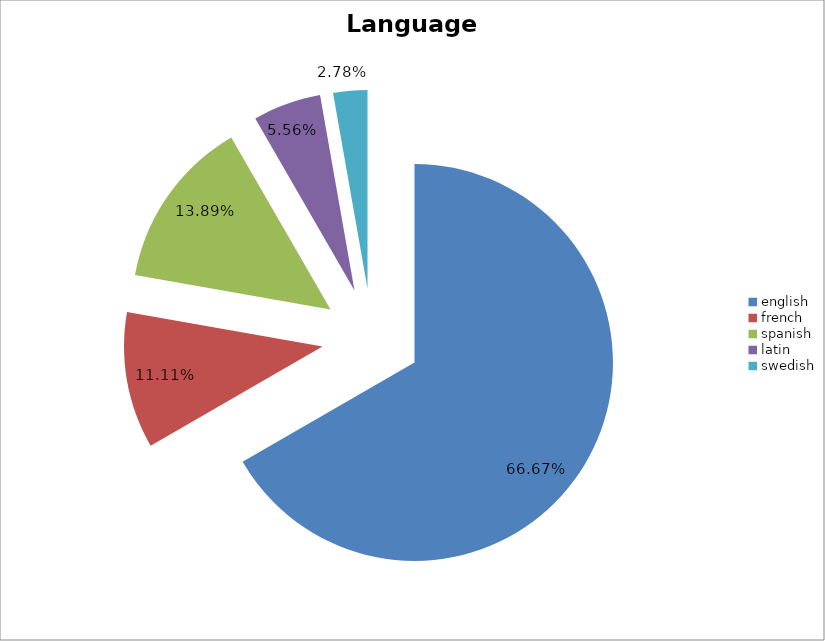
| Category | Languages |
|---|---|
| english | 0.667 |
| french | 0.111 |
| spanish | 0.139 |
| latin | 0.056 |
| swedish | 0.028 |